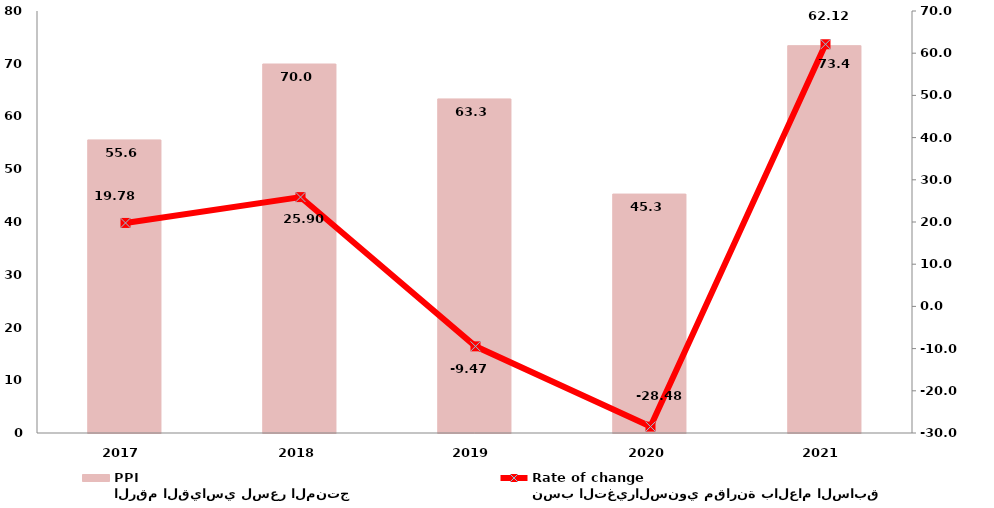
| Category | الرقم القياسي لسعر المنتج
PPI |
|---|---|
| 2017.0 | 55.561 |
| 2018.0 | 69.952 |
| 2019.0 | 63.331 |
| 2020.0 | 45.293 |
| 2021.0 | 73.428 |